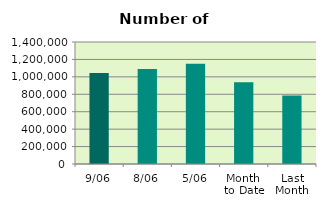
| Category | Series 0 |
|---|---|
| 9/06 | 1044424 |
| 8/06 | 1090820 |
| 5/06 | 1151060 |
| Month 
to Date | 939100.286 |
| Last
Month | 785067 |